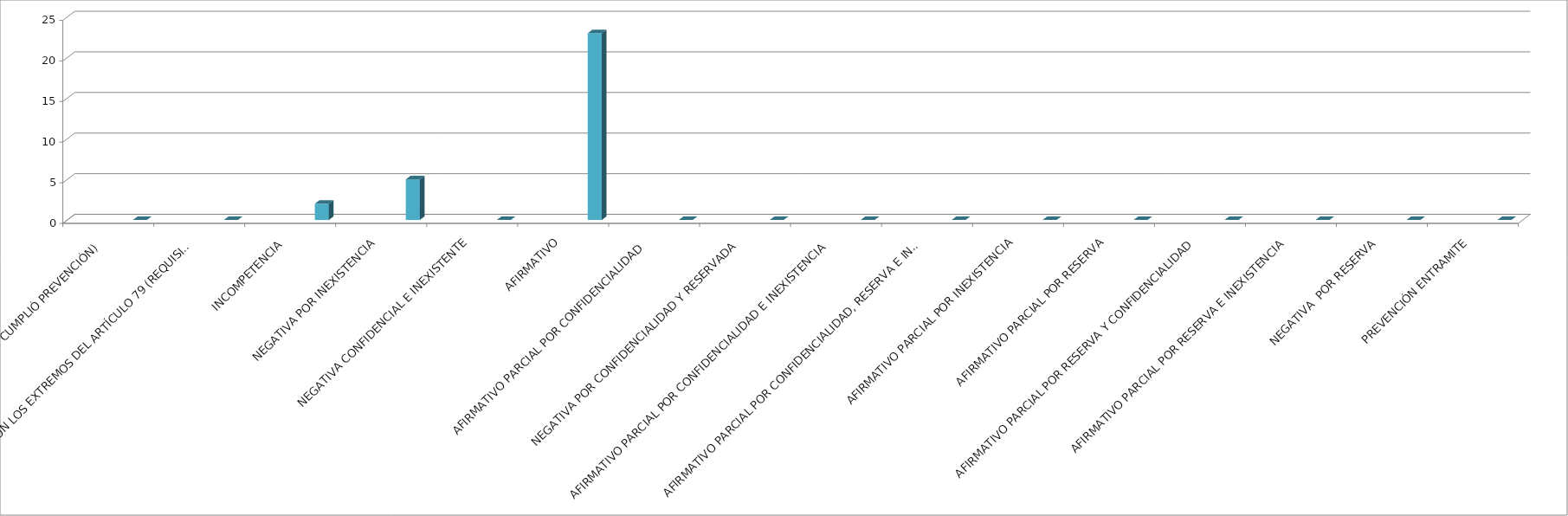
| Category | Series 0 | Series 1 | Series 2 | Series 3 | Series 4 |
|---|---|---|---|---|---|
| SE TIENE POR NO PRESENTADA ( NO CUMPLIÓ PREVENCIÓN) |  |  |  |  | 0 |
| NO CUMPLIO CON LOS EXTREMOS DEL ARTÍCULO 79 (REQUISITOS) |  |  |  |  | 0 |
| INCOMPETENCIA  |  |  |  |  | 2 |
| NEGATIVA POR INEXISTENCIA |  |  |  |  | 5 |
| NEGATIVA CONFIDENCIAL E INEXISTENTE |  |  |  |  | 0 |
| AFIRMATIVO |  |  |  |  | 23 |
| AFIRMATIVO PARCIAL POR CONFIDENCIALIDAD  |  |  |  |  | 0 |
| NEGATIVA POR CONFIDENCIALIDAD Y RESERVADA |  |  |  |  | 0 |
| AFIRMATIVO PARCIAL POR CONFIDENCIALIDAD E INEXISTENCIA |  |  |  |  | 0 |
| AFIRMATIVO PARCIAL POR CONFIDENCIALIDAD, RESERVA E INEXISTENCIA |  |  |  |  | 0 |
| AFIRMATIVO PARCIAL POR INEXISTENCIA |  |  |  |  | 0 |
| AFIRMATIVO PARCIAL POR RESERVA |  |  |  |  | 0 |
| AFIRMATIVO PARCIAL POR RESERVA Y CONFIDENCIALIDAD |  |  |  |  | 0 |
| AFIRMATIVO PARCIAL POR RESERVA E INEXISTENCIA |  |  |  |  | 0 |
| NEGATIVA  POR RESERVA |  |  |  |  | 0 |
| PREVENCIÓN ENTRAMITE |  |  |  |  | 0 |